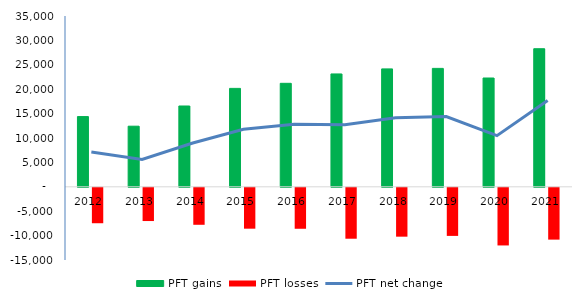
| Category | PFT gains | PFT losses |
|---|---|---|
| 2012.0 | 14390 | -7262 |
| 2013.0 | 12420 | -6812 |
| 2014.0 | 16560 | -7579 |
| 2015.0 | 20168 | -8378 |
| 2016.0 | 21206 | -8395 |
| 2017.0 | 23129 | -10434 |
| 2018.0 | 24163 | -10015 |
| 2019.0 | 24266 | -9857 |
| 2020.0 | 22294 | -11813 |
| 2021.0 | 28296 | -10618 |